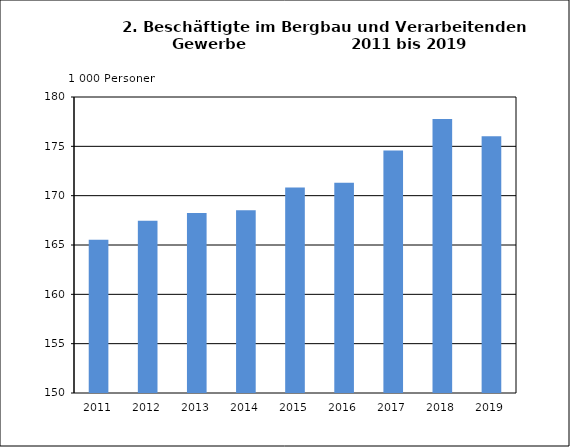
| Category | Beschäftigte |
|---|---|
| 2011.0 | 165.528 |
| 2012.0 | 167.446 |
| 2013.0 | 168.246 |
| 2014.0 | 168.527 |
| 2015.0 | 170.836 |
| 2016.0 | 171.305 |
| 2017.0 | 174.572 |
| 2018.0 | 177.778 |
| 2019.0 | 176.018 |